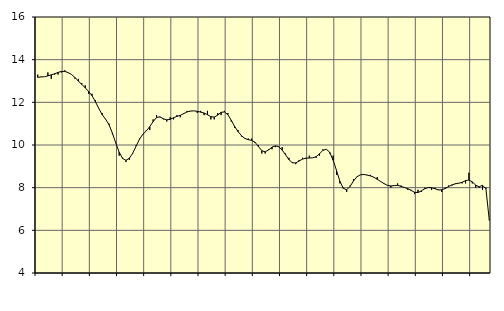
| Category | Piggar | Tillverkning av verkstadsvaror, SNI 25-30, 33 |
|---|---|---|
| nan | 13.3 | 13.17 |
| 87.0 | 13.2 | 13.19 |
| 87.0 | 13.2 | 13.2 |
| 87.0 | 13.4 | 13.24 |
| nan | 13.1 | 13.29 |
| 88.0 | 13.3 | 13.34 |
| 88.0 | 13.3 | 13.4 |
| 88.0 | 13.4 | 13.45 |
| nan | 13.5 | 13.45 |
| 89.0 | 13.4 | 13.39 |
| 89.0 | 13.3 | 13.3 |
| 89.0 | 13.1 | 13.16 |
| nan | 13.1 | 12.99 |
| 90.0 | 12.9 | 12.84 |
| 90.0 | 12.8 | 12.68 |
| 90.0 | 12.4 | 12.51 |
| nan | 12.4 | 12.31 |
| 91.0 | 12.1 | 12.03 |
| 91.0 | 11.7 | 11.71 |
| 91.0 | 11.5 | 11.42 |
| nan | 11.2 | 11.21 |
| 92.0 | 11 | 10.95 |
| 92.0 | 10.5 | 10.56 |
| 92.0 | 10.1 | 10.09 |
| nan | 9.5 | 9.66 |
| 93.0 | 9.4 | 9.37 |
| 93.0 | 9.2 | 9.28 |
| 93.0 | 9.3 | 9.38 |
| nan | 9.6 | 9.62 |
| 94.0 | 10 | 9.95 |
| 94.0 | 10.3 | 10.28 |
| 94.0 | 10.5 | 10.51 |
| nan | 10.7 | 10.66 |
| 95.0 | 10.7 | 10.86 |
| 95.0 | 11.2 | 11.1 |
| 95.0 | 11.4 | 11.29 |
| nan | 11.3 | 11.32 |
| 96.0 | 11.2 | 11.23 |
| 96.0 | 11.1 | 11.18 |
| 96.0 | 11.3 | 11.2 |
| nan | 11.2 | 11.28 |
| 97.0 | 11.4 | 11.34 |
| 97.0 | 11.3 | 11.39 |
| 97.0 | 11.5 | 11.47 |
| nan | 11.6 | 11.55 |
| 98.0 | 11.6 | 11.59 |
| 98.0 | 11.6 | 11.6 |
| 98.0 | 11.5 | 11.58 |
| nan | 11.6 | 11.54 |
| 99.0 | 11.4 | 11.5 |
| 99.0 | 11.6 | 11.42 |
| 99.0 | 11.2 | 11.33 |
| nan | 11.2 | 11.31 |
| 0.0 | 11.5 | 11.4 |
| 0.0 | 11.4 | 11.53 |
| 0.0 | 11.6 | 11.55 |
| nan | 11.5 | 11.42 |
| 1.0 | 11.1 | 11.16 |
| 1.0 | 10.8 | 10.87 |
| 1.0 | 10.7 | 10.63 |
| nan | 10.4 | 10.44 |
| 2.0 | 10.3 | 10.31 |
| 2.0 | 10.3 | 10.25 |
| 2.0 | 10.3 | 10.22 |
| nan | 10.1 | 10.13 |
| 3.0 | 10 | 9.93 |
| 3.0 | 9.6 | 9.73 |
| 3.0 | 9.6 | 9.68 |
| nan | 9.8 | 9.77 |
| 4.0 | 9.8 | 9.9 |
| 4.0 | 9.9 | 9.96 |
| 4.0 | 9.9 | 9.92 |
| nan | 9.9 | 9.76 |
| 5.0 | 9.6 | 9.54 |
| 5.0 | 9.4 | 9.31 |
| 5.0 | 9.2 | 9.17 |
| nan | 9.1 | 9.16 |
| 6.0 | 9.3 | 9.25 |
| 6.0 | 9.4 | 9.34 |
| 6.0 | 9.4 | 9.38 |
| nan | 9.5 | 9.39 |
| 7.0 | 9.4 | 9.4 |
| 7.0 | 9.4 | 9.45 |
| 7.0 | 9.5 | 9.59 |
| nan | 9.8 | 9.75 |
| 8.0 | 9.8 | 9.8 |
| 8.0 | 9.6 | 9.66 |
| 8.0 | 9.5 | 9.29 |
| nan | 8.6 | 8.81 |
| 9.0 | 8.2 | 8.3 |
| 9.0 | 8 | 7.97 |
| 9.0 | 7.8 | 7.9 |
| nan | 8.1 | 8.06 |
| 10.0 | 8.4 | 8.31 |
| 10.0 | 8.5 | 8.51 |
| 10.0 | 8.6 | 8.6 |
| nan | 8.6 | 8.62 |
| 11.0 | 8.6 | 8.59 |
| 11.0 | 8.6 | 8.55 |
| 11.0 | 8.5 | 8.49 |
| nan | 8.5 | 8.39 |
| 12.0 | 8.3 | 8.29 |
| 12.0 | 8.2 | 8.19 |
| 12.0 | 8.1 | 8.11 |
| nan | 8 | 8.08 |
| 13.0 | 8.1 | 8.1 |
| 13.0 | 8.2 | 8.11 |
| 13.0 | 8.1 | 8.06 |
| nan | 8 | 8.01 |
| 14.0 | 7.9 | 7.95 |
| 14.0 | 7.9 | 7.87 |
| 14.0 | 7.7 | 7.78 |
| nan | 7.9 | 7.77 |
| 15.0 | 7.8 | 7.85 |
| 15.0 | 8 | 7.95 |
| 15.0 | 8 | 8.01 |
| nan | 7.9 | 8 |
| 16.0 | 8 | 7.95 |
| 16.0 | 7.9 | 7.89 |
| 16.0 | 7.8 | 7.9 |
| nan | 8 | 7.96 |
| 17.0 | 8.1 | 8.05 |
| 17.0 | 8.1 | 8.13 |
| 17.0 | 8.2 | 8.18 |
| nan | 8.2 | 8.21 |
| 18.0 | 8.2 | 8.25 |
| 18.0 | 8.2 | 8.33 |
| 18.0 | 8.7 | 8.36 |
| nan | 8.2 | 8.27 |
| 19.0 | 8 | 8.12 |
| 19.0 | 8 | 8.04 |
| 19.0 | 7.9 | 8.11 |
| nan | 8 | 7.95 |
| 20.0 | 6.5 | 6.47 |